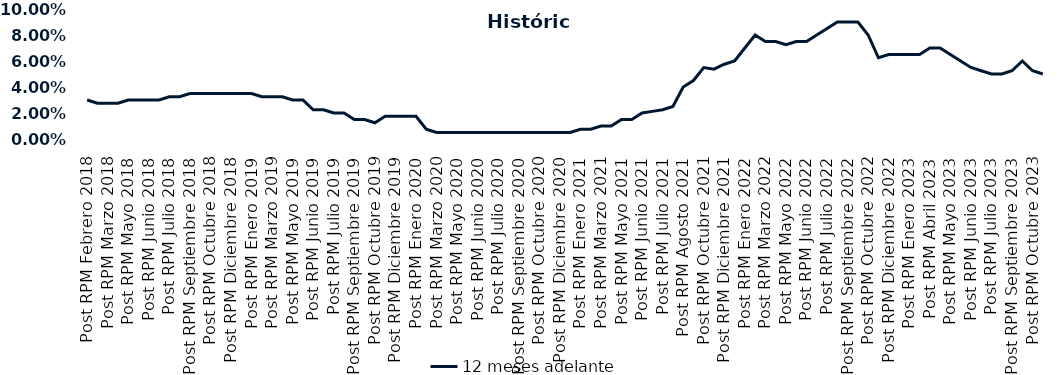
| Category | 12 meses adelante  |
|---|---|
| Post RPM Febrero 2018 | 0.03 |
| Pre RPM Marzo 2018 | 0.028 |
| Post RPM Marzo 2018 | 0.028 |
| Pre RPM Mayo 2018 | 0.028 |
| Post RPM Mayo 2018 | 0.03 |
| Pre RPM Junio 2018 | 0.03 |
| Post RPM Junio 2018 | 0.03 |
| Pre RPM Julio 2018 | 0.03 |
| Post RPM Julio 2018 | 0.032 |
| Pre RPM Septiembre 2018 | 0.032 |
| Post RPM Septiembre 2018 | 0.035 |
| Pre RPM Octubre 2018 | 0.035 |
| Post RPM Octubre 2018 | 0.035 |
| Pre RPM Diciembre 2018 | 0.035 |
| Post RPM Diciembre 2018 | 0.035 |
| Pre RPM Enero 2019 | 0.035 |
| Post RPM Enero 2019 | 0.035 |
| Pre RPM Marzo 2019 | 0.032 |
| Post RPM Marzo 2019 | 0.032 |
| Pre RPM Mayo 2019 | 0.032 |
| Post RPM Mayo 2019 | 0.03 |
| Pre RPM Junio 2019 | 0.03 |
| Post RPM Junio 2019 | 0.022 |
| Pre RPM Julio 2019 | 0.022 |
| Post RPM Julio 2019 | 0.02 |
| Pre RPM Septiembre 2019 | 0.02 |
| Post RPM Septiembre 2019 | 0.015 |
| Pre RPM Octubre 2019 | 0.015 |
| Post RPM Octubre 2019 | 0.012 |
| Pre RPM Diciembre 2019 | 0.018 |
| Post RPM Diciembre 2019 | 0.018 |
| Pre RPM Enero 2020 | 0.018 |
| Post RPM Enero 2020 | 0.018 |
| Pre RPM Marzo 2020 | 0.008 |
| Post RPM Marzo 2020 | 0.005 |
| Pre RPM Mayo 2020 | 0.005 |
| Post RPM Mayo 2020 | 0.005 |
| Pre RPM Junio 2020 | 0.005 |
| Post RPM Junio 2020 | 0.005 |
| Pre RPM Julio 2020 | 0.005 |
| Post RPM Julio 2020 | 0.005 |
| Pre RPM Septiembre 2020 | 0.005 |
| Post RPM Septiembre 2020 | 0.005 |
| Pre RPM Octubre 2020 | 0.005 |
| Post RPM Octubre 2020 | 0.005 |
| Pre RPM Diciembre 2020 | 0.005 |
| Post RPM Diciembre 2020 | 0.005 |
| Pre RPM Enero 2021 | 0.005 |
| Post RPM Enero 2021 | 0.008 |
| Pre RPM Marzo 2021 | 0.008 |
| Post RPM Marzo 2021 | 0.01 |
| Pre RPM Mayo 2021 | 0.01 |
| Post RPM Mayo 2021 | 0.015 |
| Pre RPM Junio 2021 | 0.015 |
| Post RPM Junio 2021 | 0.02 |
| Pre RPM Julio 2021 | 0.021 |
| Post RPM Julio 2021 | 0.022 |
| Pre RPM Agosto 2021 | 0.025 |
| Post RPM Agosto 2021 | 0.04 |
| Pre RPM Octubre 2021 | 0.045 |
| Post RPM Octubre 2021 | 0.055 |
| Pre RPM Diciembre 2021 | 0.054 |
| Post RPM Diciembre 2021 | 0.058 |
| Pre RPM Enero 2022 | 0.06 |
| Post RPM Enero 2022 | 0.07 |
| Pre RPM Marzo 2022 | 0.08 |
| Post RPM Marzo 2022 | 0.075 |
| Pre RPM Mayo 2022 | 0.075 |
| Post RPM Mayo 2022 | 0.072 |
| Pre RPM Junio 2022 | 0.075 |
| Post RPM Junio 2022 | 0.075 |
| Pre RPM Julio 2022 | 0.08 |
| Post RPM Julio 2022 | 0.085 |
| Pre RPM Septiembre 2022 | 0.09 |
| Post RPM Septiembre 2022 | 0.09 |
| Pre RPM Octubre 2022 | 0.09 |
| Post RPM Octubre 2022 | 0.08 |
| Pre RPM Diciembre 2022 | 0.062 |
| Post RPM Diciembre 2022 | 0.065 |
| Pre RPM Enero 2023 | 0.065 |
| Post RPM Enero 2023 | 0.065 |
| Pre RPM Abril 2023 | 0.065 |
| Post RPM Abril 2023 | 0.07 |
| Pre RPM Mayo 2023 | 0.07 |
| Post RPM Mayo 2023 | 0.065 |
| Pre RPM Junio 2023 | 0.06 |
| Post RPM Junio 2023 | 0.055 |
| Pre RPM Julio 2023 | 0.052 |
| Post RPM Julio 2023 | 0.05 |
| Pre RPM Septiembre 2023 | 0.05 |
| Post RPM Septiembre 2023 | 0.052 |
| Pre RPM Octubre 2023 | 0.06 |
| Post RPM Octubre 2023 | 0.052 |
| Pre RPM Diciembre 2023 | 0.05 |